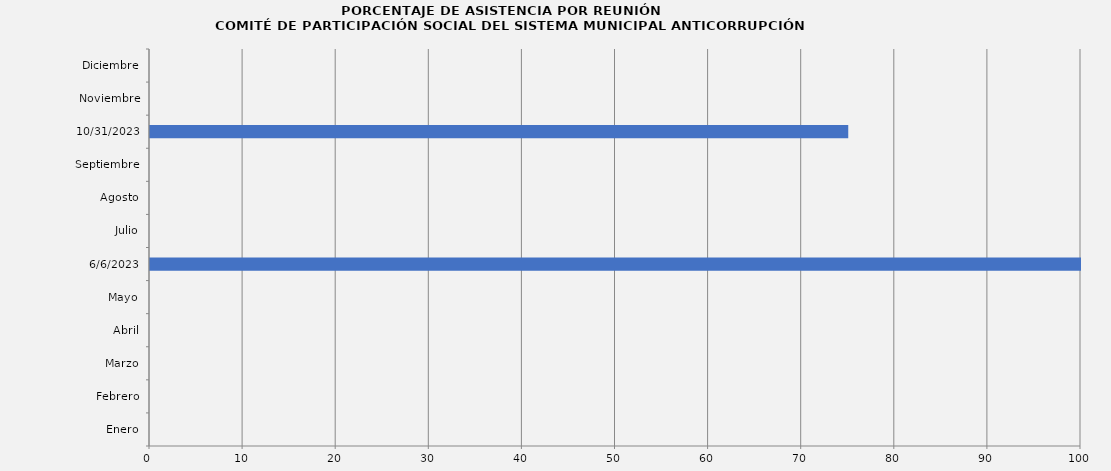
| Category | Series 0 |
|---|---|
| Enero | 0 |
| Febrero | 0 |
| Marzo | 0 |
| Abril | 0 |
| Mayo | 0 |
| 06/06/2023 | 100 |
| Julio | 0 |
| Agosto | 0 |
| Septiembre | 0 |
| 31/10/2023 | 75 |
| Noviembre | 0 |
| Diciembre | 0 |